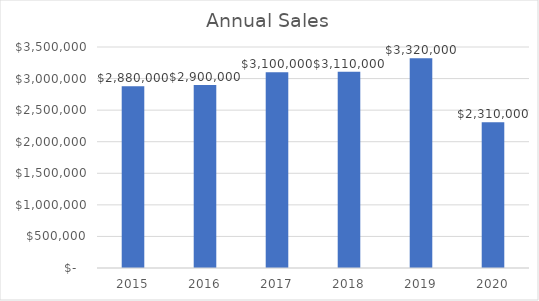
| Category | Annual Sales |
|---|---|
| 2015.0 | 2880000 |
| 2016.0 | 2900000 |
| 2017.0 | 3100000 |
| 2018.0 | 3110000 |
| 2019.0 | 3320000 |
| 2020.0 | 2310000 |